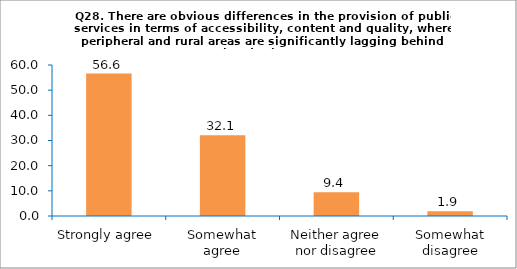
| Category | Series 0 |
|---|---|
| Strongly agree | 56.604 |
| Somewhat agree | 32.075 |
| Neither agree nor disagree | 9.434 |
| Somewhat disagree | 1.887 |